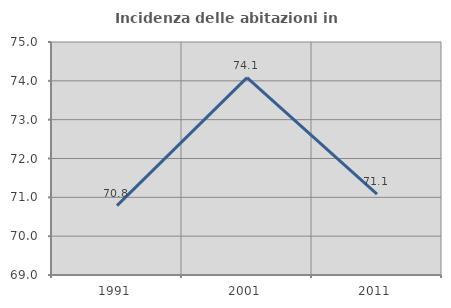
| Category | Incidenza delle abitazioni in proprietà  |
|---|---|
| 1991.0 | 70.788 |
| 2001.0 | 74.084 |
| 2011.0 | 71.083 |